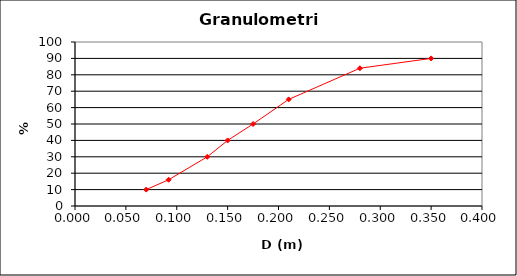
| Category | D (m) |
|---|---|
| 0.07 | 10 |
| 0.092 | 16 |
| 0.13 | 30 |
| 0.15 | 40 |
| 0.175 | 50 |
| 0.21 | 65 |
| 0.28 | 84 |
| 0.35 | 90 |